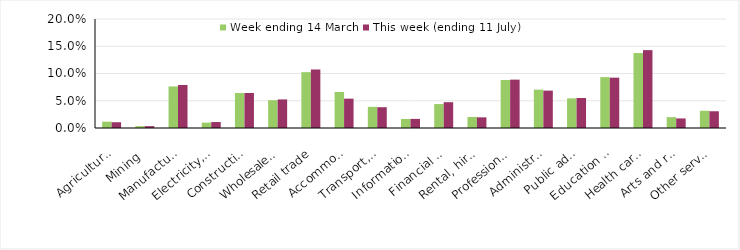
| Category | Week ending 14 March | This week (ending 11 July) |
|---|---|---|
| Agriculture, forestry and fishing | 0.012 | 0.011 |
| Mining | 0.003 | 0.003 |
| Manufacturing | 0.076 | 0.079 |
| Electricity, gas, water and waste services | 0.01 | 0.011 |
| Construction | 0.064 | 0.064 |
| Wholesale trade | 0.051 | 0.052 |
| Retail trade | 0.102 | 0.107 |
| Accommodation and food services | 0.066 | 0.054 |
| Transport, postal and warehousing | 0.039 | 0.038 |
| Information media and telecommunications | 0.017 | 0.017 |
| Financial and insurance services | 0.044 | 0.047 |
| Rental, hiring and real estate services | 0.02 | 0.02 |
| Professional, scientific and technical services | 0.088 | 0.089 |
| Administrative and support services | 0.07 | 0.069 |
| Public administration and safety | 0.054 | 0.055 |
| Education and training | 0.093 | 0.092 |
| Health care and social assistance | 0.138 | 0.143 |
| Arts and recreation services | 0.02 | 0.018 |
| Other services | 0.032 | 0.031 |